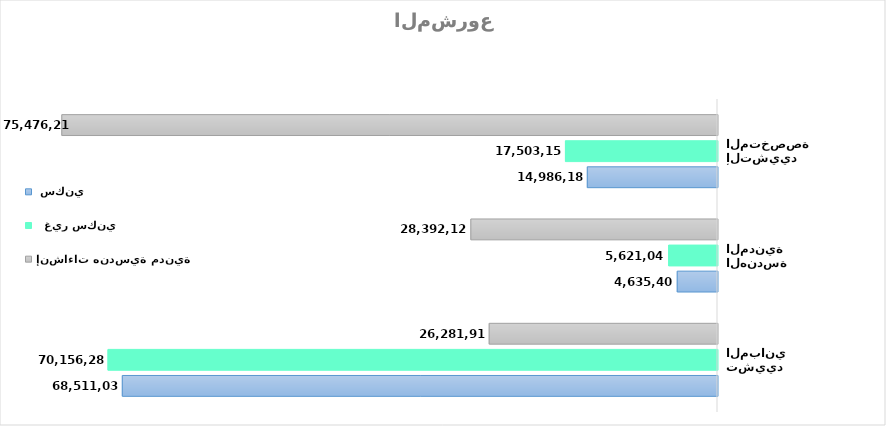
| Category |  سكني   |   غير سكني   | إنشاءات هندسية مدنية   |
|---|---|---|---|
| تشييد المباني | 68511037.671 | 70156286.394 | 26281914.311 |
| الهندسة المدنية | 4635408.921 | 5621049.139 | 28392120.947 |
| أنشطة التشييد المتخصصة | 14986182.713 | 17503152.139 | 75476217.053 |